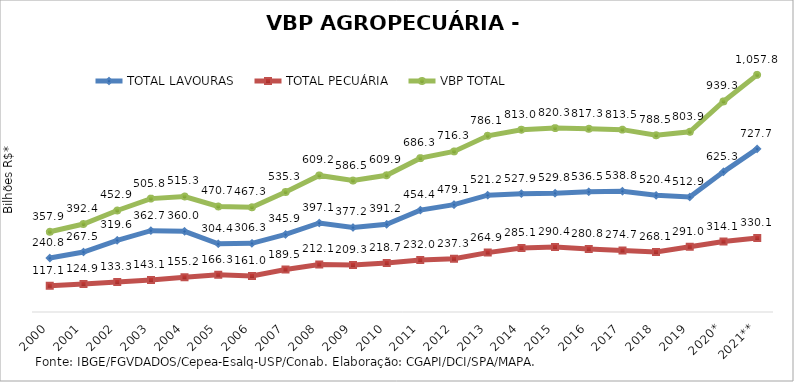
| Category | TOTAL LAVOURAS | TOTAL PECUÁRIA | VBP TOTAL |
|---|---|---|---|
| 2000 | 240.829 | 117.064 | 357.893 |
| 2001 | 267.516 | 124.893 | 392.409 |
| 2002 | 319.557 | 133.324 | 452.881 |
| 2003 | 362.695 | 143.1 | 505.795 |
| 2004 | 360.039 | 155.222 | 515.262 |
| 2005 | 304.397 | 166.281 | 470.678 |
| 2006 | 306.257 | 161.045 | 467.302 |
| 2007 | 345.861 | 189.461 | 535.322 |
| 2008 | 397.134 | 212.052 | 609.186 |
| 2009 | 377.225 | 209.294 | 586.518 |
| 2010 | 391.224 | 218.671 | 609.895 |
| 2011 | 454.358 | 231.954 | 686.312 |
| 2012 | 479.065 | 237.275 | 716.341 |
| 2013 | 521.226 | 264.889 | 786.115 |
| 2014 | 527.932 | 285.096 | 813.028 |
| 2015 | 529.848 | 290.435 | 820.283 |
| 2016 | 536.548 | 280.778 | 817.326 |
| 2017 | 538.775 | 274.745 | 813.52 |
| 2018 | 520.427 | 268.1 | 788.527 |
| 2019 | 512.943 | 290.966 | 803.909 |
| 2020* | 625.289 | 314.054 | 939.344 |
| 2021** | 727.717 | 330.124 | 1057.841 |